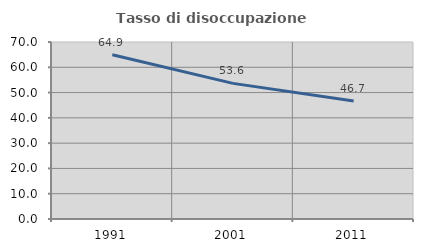
| Category | Tasso di disoccupazione giovanile  |
|---|---|
| 1991.0 | 64.929 |
| 2001.0 | 53.636 |
| 2011.0 | 46.667 |